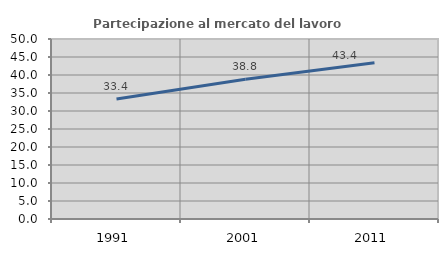
| Category | Partecipazione al mercato del lavoro  femminile |
|---|---|
| 1991.0 | 33.357 |
| 2001.0 | 38.794 |
| 2011.0 | 43.419 |